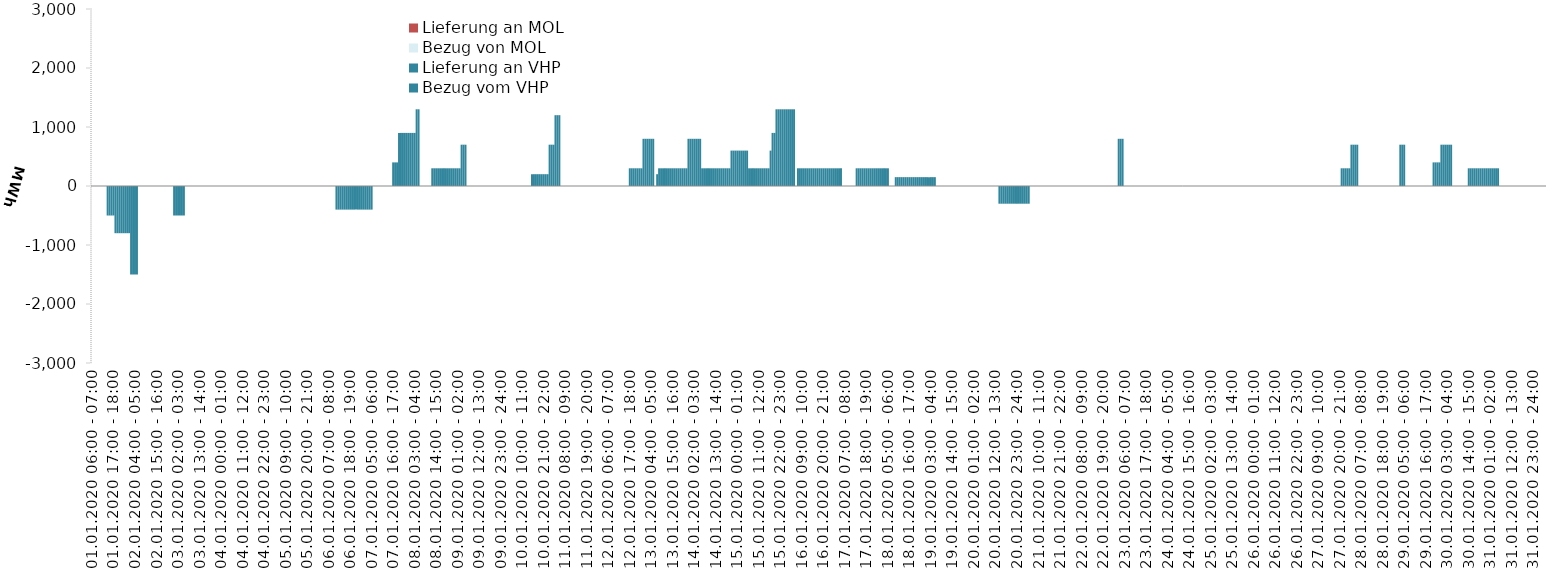
| Category | Bezug vom VHP | Lieferung an VHP | Bezug von MOL | Lieferung an MOL |
|---|---|---|---|---|
| 01.01.2020 06:00 - 07:00 | 0 | 0 | 0 | 0 |
| 01.01.2020 07:00 - 08:00 | 0 | 0 | 0 | 0 |
| 01.01.2020 08:00 - 09:00 | 0 | 0 | 0 | 0 |
| 01.01.2020 09:00 - 10:00 | 0 | 0 | 0 | 0 |
| 01.01.2020 10:00 - 11:00 | 0 | 0 | 0 | 0 |
| 01.01.2020 11:00 - 12:00 | 0 | 0 | 0 | 0 |
| 01.01.2020 12:00 - 13:00 | 0 | 0 | 0 | 0 |
| 01.01.2020 13:00 - 14:00 | 0 | 0 | 0 | 0 |
| 01.01.2020 14:00 - 15:00 | 0 | -500 | 0 | 0 |
| 01.01.2020 15:00 - 16:00 | 0 | -500 | 0 | 0 |
| 01.01.2020 16:00 - 17:00 | 0 | -500 | 0 | 0 |
| 01.01.2020 17:00 - 18:00 | 0 | -500 | 0 | 0 |
| 01.01.2020 18:00 - 19:00 | 0 | -800 | 0 | 0 |
| 01.01.2020 19:00 - 20:00 | 0 | -800 | 0 | 0 |
| 01.01.2020 20:00 - 21:00 | 0 | -800 | 0 | 0 |
| 01.01.2020 21:00 - 22:00 | 0 | -800 | 0 | 0 |
| 01.01.2020 22:00 - 23:00 | 0 | -800 | 0 | 0 |
| 01.01.2020 23:00 - 24:00 | 0 | -800 | 0 | 0 |
| 02.01.2020 00:00 - 01:00 | 0 | -800 | 0 | 0 |
| 02.01.2020 01:00 - 02:00 | 0 | -800 | 0 | 0 |
| 02.01.2020 02:00 - 03:00 | 0 | -1500 | 0 | 0 |
| 02.01.2020 03:00 - 04:00 | 0 | -1500 | 0 | 0 |
| 02.01.2020 04:00 - 05:00 | 0 | -1500 | 0 | 0 |
| 02.01.2020 05:00 - 06:00 | 0 | -1500 | 0 | 0 |
| 02.01.2020 06:00 - 07:00 | 0 | 0 | 0 | 0 |
| 02.01.2020 07:00 - 08:00 | 0 | 0 | 0 | 0 |
| 02.01.2020 08:00 - 09:00 | 0 | 0 | 0 | 0 |
| 02.01.2020 09:00 - 10:00 | 0 | 0 | 0 | 0 |
| 02.01.2020 10:00 - 11:00 | 0 | 0 | 0 | 0 |
| 02.01.2020 11:00 - 12:00 | 0 | 0 | 0 | 0 |
| 02.01.2020 12:00 - 13:00 | 0 | 0 | 0 | 0 |
| 02.01.2020 13:00 - 14:00 | 0 | 0 | 0 | 0 |
| 02.01.2020 14:00 - 15:00 | 0 | 0 | 0 | 0 |
| 02.01.2020 15:00 - 16:00 | 0 | 0 | 0 | 0 |
| 02.01.2020 16:00 - 17:00 | 0 | 0 | 0 | 0 |
| 02.01.2020 17:00 - 18:00 | 0 | 0 | 0 | 0 |
| 02.01.2020 18:00 - 19:00 | 0 | 0 | 0 | 0 |
| 02.01.2020 19:00 - 20:00 | 0 | 0 | 0 | 0 |
| 02.01.2020 20:00 - 21:00 | 0 | 0 | 0 | 0 |
| 02.01.2020 21:00 - 22:00 | 0 | 0 | 0 | 0 |
| 02.01.2020 22:00 - 23:00 | 0 | 0 | 0 | 0 |
| 02.01.2020 23:00 - 24:00 | 0 | 0 | 0 | 0 |
| 03.01.2020 00:00 - 01:00 | 0 | -500 | 0 | 0 |
| 03.01.2020 01:00 - 02:00 | 0 | -500 | 0 | 0 |
| 03.01.2020 02:00 - 03:00 | 0 | -500 | 0 | 0 |
| 03.01.2020 03:00 - 04:00 | 0 | -500 | 0 | 0 |
| 03.01.2020 04:00 - 05:00 | 0 | -500 | 0 | 0 |
| 03.01.2020 05:00 - 06:00 | 0 | -500 | 0 | 0 |
| 03.01.2020 06:00 - 07:00 | 0 | 0 | 0 | 0 |
| 03.01.2020 07:00 - 08:00 | 0 | 0 | 0 | 0 |
| 03.01.2020 08:00 - 09:00 | 0 | 0 | 0 | 0 |
| 03.01.2020 09:00 - 10:00 | 0 | 0 | 0 | 0 |
| 03.01.2020 10:00 - 11:00 | 0 | 0 | 0 | 0 |
| 03.01.2020 11:00 - 12:00 | 0 | 0 | 0 | 0 |
| 03.01.2020 12:00 - 13:00 | 0 | 0 | 0 | 0 |
| 03.01.2020 13:00 - 14:00 | 0 | 0 | 0 | 0 |
| 03.01.2020 14:00 - 15:00 | 0 | 0 | 0 | 0 |
| 03.01.2020 15:00 - 16:00 | 0 | 0 | 0 | 0 |
| 03.01.2020 16:00 - 17:00 | 0 | 0 | 0 | 0 |
| 03.01.2020 17:00 - 18:00 | 0 | 0 | 0 | 0 |
| 03.01.2020 18:00 - 19:00 | 0 | 0 | 0 | 0 |
| 03.01.2020 19:00 - 20:00 | 0 | 0 | 0 | 0 |
| 03.01.2020 20:00 - 21:00 | 0 | 0 | 0 | 0 |
| 03.01.2020 21:00 - 22:00 | 0 | 0 | 0 | 0 |
| 03.01.2020 22:00 - 23:00 | 0 | 0 | 0 | 0 |
| 03.01.2020 23:00 - 24:00 | 0 | 0 | 0 | 0 |
| 04.01.2020 00:00 - 01:00 | 0 | 0 | 0 | 0 |
| 04.01.2020 01:00 - 02:00 | 0 | 0 | 0 | 0 |
| 04.01.2020 02:00 - 03:00 | 0 | 0 | 0 | 0 |
| 04.01.2020 03:00 - 04:00 | 0 | 0 | 0 | 0 |
| 04.01.2020 04:00 - 05:00 | 0 | 0 | 0 | 0 |
| 04.01.2020 05:00 - 06:00 | 0 | 0 | 0 | 0 |
| 04.01.2020 06:00 - 07:00 | 0 | 0 | 0 | 0 |
| 04.01.2020 07:00 - 08:00 | 0 | 0 | 0 | 0 |
| 04.01.2020 08:00 - 09:00 | 0 | 0 | 0 | 0 |
| 04.01.2020 09:00 - 10:00 | 0 | 0 | 0 | 0 |
| 04.01.2020 10:00 - 11:00 | 0 | 0 | 0 | 0 |
| 04.01.2020 11:00 - 12:00 | 0 | 0 | 0 | 0 |
| 04.01.2020 12:00 - 13:00 | 0 | 0 | 0 | 0 |
| 04.01.2020 13:00 - 14:00 | 0 | 0 | 0 | 0 |
| 04.01.2020 14:00 - 15:00 | 0 | 0 | 0 | 0 |
| 04.01.2020 15:00 - 16:00 | 0 | 0 | 0 | 0 |
| 04.01.2020 16:00 - 17:00 | 0 | 0 | 0 | 0 |
| 04.01.2020 17:00 - 18:00 | 0 | 0 | 0 | 0 |
| 04.01.2020 18:00 - 19:00 | 0 | 0 | 0 | 0 |
| 04.01.2020 19:00 - 20:00 | 0 | 0 | 0 | 0 |
| 04.01.2020 20:00 - 21:00 | 0 | 0 | 0 | 0 |
| 04.01.2020 21:00 - 22:00 | 0 | 0 | 0 | 0 |
| 04.01.2020 22:00 - 23:00 | 0 | 0 | 0 | 0 |
| 04.01.2020 23:00 - 24:00 | 0 | 0 | 0 | 0 |
| 05.01.2020 00:00 - 01:00 | 0 | 0 | 0 | 0 |
| 05.01.2020 01:00 - 02:00 | 0 | 0 | 0 | 0 |
| 05.01.2020 02:00 - 03:00 | 0 | 0 | 0 | 0 |
| 05.01.2020 03:00 - 04:00 | 0 | 0 | 0 | 0 |
| 05.01.2020 04:00 - 05:00 | 0 | 0 | 0 | 0 |
| 05.01.2020 05:00 - 06:00 | 0 | 0 | 0 | 0 |
| 05.01.2020 06:00 - 07:00 | 0 | 0 | 0 | 0 |
| 05.01.2020 07:00 - 08:00 | 0 | 0 | 0 | 0 |
| 05.01.2020 08:00 - 09:00 | 0 | 0 | 0 | 0 |
| 05.01.2020 09:00 - 10:00 | 0 | 0 | 0 | 0 |
| 05.01.2020 10:00 - 11:00 | 0 | 0 | 0 | 0 |
| 05.01.2020 11:00 - 12:00 | 0 | 0 | 0 | 0 |
| 05.01.2020 12:00 - 13:00 | 0 | 0 | 0 | 0 |
| 05.01.2020 13:00 - 14:00 | 0 | 0 | 0 | 0 |
| 05.01.2020 14:00 - 15:00 | 0 | 0 | 0 | 0 |
| 05.01.2020 15:00 - 16:00 | 0 | 0 | 0 | 0 |
| 05.01.2020 16:00 - 17:00 | 0 | 0 | 0 | 0 |
| 05.01.2020 17:00 - 18:00 | 0 | 0 | 0 | 0 |
| 05.01.2020 18:00 - 19:00 | 0 | 0 | 0 | 0 |
| 05.01.2020 19:00 - 20:00 | 0 | 0 | 0 | 0 |
| 05.01.2020 20:00 - 21:00 | 0 | 0 | 0 | 0 |
| 05.01.2020 21:00 - 22:00 | 0 | 0 | 0 | 0 |
| 05.01.2020 22:00 - 23:00 | 0 | 0 | 0 | 0 |
| 05.01.2020 23:00 - 24:00 | 0 | 0 | 0 | 0 |
| 06.01.2020 00:00 - 01:00 | 0 | 0 | 0 | 0 |
| 06.01.2020 01:00 - 02:00 | 0 | 0 | 0 | 0 |
| 06.01.2020 02:00 - 03:00 | 0 | 0 | 0 | 0 |
| 06.01.2020 03:00 - 04:00 | 0 | 0 | 0 | 0 |
| 06.01.2020 04:00 - 05:00 | 0 | 0 | 0 | 0 |
| 06.01.2020 05:00 - 06:00 | 0 | 0 | 0 | 0 |
| 06.01.2020 06:00 - 07:00 | 0 | 0 | 0 | 0 |
| 06.01.2020 07:00 - 08:00 | 0 | 0 | 0 | 0 |
| 06.01.2020 08:00 - 09:00 | 0 | 0 | 0 | 0 |
| 06.01.2020 09:00 - 10:00 | 0 | 0 | 0 | 0 |
| 06.01.2020 10:00 - 11:00 | 0 | 0 | 0 | 0 |
| 06.01.2020 11:00 - 12:00 | 0 | -400 | 0 | 0 |
| 06.01.2020 12:00 - 13:00 | 0 | -400 | 0 | 0 |
| 06.01.2020 13:00 - 14:00 | 0 | -400 | 0 | 0 |
| 06.01.2020 14:00 - 15:00 | 0 | -400 | 0 | 0 |
| 06.01.2020 15:00 - 16:00 | 0 | -400 | 0 | 0 |
| 06.01.2020 16:00 - 17:00 | 0 | -400 | 0 | 0 |
| 06.01.2020 17:00 - 18:00 | 0 | -400 | 0 | 0 |
| 06.01.2020 18:00 - 19:00 | 0 | -400 | 0 | 0 |
| 06.01.2020 19:00 - 20:00 | 0 | -400 | 0 | 0 |
| 06.01.2020 20:00 - 21:00 | 0 | -400 | 0 | 0 |
| 06.01.2020 21:00 - 22:00 | 0 | -400 | 0 | 0 |
| 06.01.2020 22:00 - 23:00 | 0 | -400 | 0 | 0 |
| 06.01.2020 23:00 - 24:00 | 0 | -400 | 0 | 0 |
| 07.01.2020 00:00 - 01:00 | 0 | -400 | 0 | 0 |
| 07.01.2020 01:00 - 02:00 | 0 | -400 | 0 | 0 |
| 07.01.2020 02:00 - 03:00 | 0 | -400 | 0 | 0 |
| 07.01.2020 03:00 - 04:00 | 0 | -400 | 0 | 0 |
| 07.01.2020 04:00 - 05:00 | 0 | -400 | 0 | 0 |
| 07.01.2020 05:00 - 06:00 | 0 | -400 | 0 | 0 |
| 07.01.2020 06:00 - 07:00 | 0 | 0 | 0 | 0 |
| 07.01.2020 07:00 - 08:00 | 0 | 0 | 0 | 0 |
| 07.01.2020 08:00 - 09:00 | 0 | 0 | 0 | 0 |
| 07.01.2020 09:00 - 10:00 | 0 | 0 | 0 | 0 |
| 07.01.2020 10:00 - 11:00 | 0 | 0 | 0 | 0 |
| 07.01.2020 11:00 - 12:00 | 0 | 0 | 0 | 0 |
| 07.01.2020 12:00 - 13:00 | 0 | 0 | 0 | 0 |
| 07.01.2020 13:00 - 14:00 | 0 | 0 | 0 | 0 |
| 07.01.2020 14:00 - 15:00 | 0 | 0 | 0 | 0 |
| 07.01.2020 15:00 - 16:00 | 0 | 0 | 0 | 0 |
| 07.01.2020 16:00 - 17:00 | 400 | 0 | 0 | 0 |
| 07.01.2020 17:00 - 18:00 | 400 | 0 | 0 | 0 |
| 07.01.2020 18:00 - 19:00 | 400 | 0 | 0 | 0 |
| 07.01.2020 19:00 - 20:00 | 900 | 0 | 0 | 0 |
| 07.01.2020 20:00 - 21:00 | 900 | 0 | 0 | 0 |
| 07.01.2020 21:00 - 22:00 | 900 | 0 | 0 | 0 |
| 07.01.2020 22:00 - 23:00 | 900 | 0 | 0 | 0 |
| 07.01.2020 23:00 - 24:00 | 900 | 0 | 0 | 0 |
| 08.01.2020 00:00 - 01:00 | 900 | 0 | 0 | 0 |
| 08.01.2020 01:00 - 02:00 | 900 | 0 | 0 | 0 |
| 08.01.2020 02:00 - 03:00 | 900 | 0 | 0 | 0 |
| 08.01.2020 03:00 - 04:00 | 900 | 0 | 0 | 0 |
| 08.01.2020 04:00 - 05:00 | 1300 | 0 | 0 | 0 |
| 08.01.2020 05:00 - 06:00 | 1300 | 0 | 0 | 0 |
| 08.01.2020 06:00 - 07:00 | 0 | 0 | 0 | 0 |
| 08.01.2020 07:00 - 08:00 | 0 | 0 | 0 | 0 |
| 08.01.2020 08:00 - 09:00 | 0 | 0 | 0 | 0 |
| 08.01.2020 09:00 - 10:00 | 0 | 0 | 0 | 0 |
| 08.01.2020 10:00 - 11:00 | 0 | 0 | 0 | 0 |
| 08.01.2020 11:00 - 12:00 | 0 | 0 | 0 | 0 |
| 08.01.2020 12:00 - 13:00 | 300 | 0 | 0 | 0 |
| 08.01.2020 13:00 - 14:00 | 300 | 0 | 0 | 0 |
| 08.01.2020 14:00 - 15:00 | 300 | 0 | 0 | 0 |
| 08.01.2020 15:00 - 16:00 | 300 | 0 | 0 | 0 |
| 08.01.2020 16:00 - 17:00 | 300 | 0 | 0 | 0 |
| 08.01.2020 17:00 - 18:00 | 300 | 0 | 0 | 0 |
| 08.01.2020 18:00 - 19:00 | 300 | 0 | 0 | 0 |
| 08.01.2020 19:00 - 20:00 | 300 | 0 | 0 | 0 |
| 08.01.2020 20:00 - 21:00 | 300 | 0 | 0 | 0 |
| 08.01.2020 21:00 - 22:00 | 300 | 0 | 0 | 0 |
| 08.01.2020 22:00 - 23:00 | 300 | 0 | 0 | 0 |
| 08.01.2020 23:00 - 24:00 | 300 | 0 | 0 | 0 |
| 09.01.2020 00:00 - 01:00 | 300 | 0 | 0 | 0 |
| 09.01.2020 01:00 - 02:00 | 300 | 0 | 0 | 0 |
| 09.01.2020 02:00 - 03:00 | 300 | 0 | 0 | 0 |
| 09.01.2020 03:00 - 04:00 | 700 | 0 | 0 | 0 |
| 09.01.2020 04:00 - 05:00 | 700 | 0 | 0 | 0 |
| 09.01.2020 05:00 - 06:00 | 700 | 0 | 0 | 0 |
| 09.01.2020 06:00 - 07:00 | 0 | 0 | 0 | 0 |
| 09.01.2020 07:00 - 08:00 | 0 | 0 | 0 | 0 |
| 09.01.2020 08:00 - 09:00 | 0 | 0 | 0 | 0 |
| 09.01.2020 09:00 - 10:00 | 0 | 0 | 0 | 0 |
| 09.01.2020 10:00 - 11:00 | 0 | 0 | 0 | 0 |
| 09.01.2020 11:00 - 12:00 | 0 | 0 | 0 | 0 |
| 09.01.2020 12:00 - 13:00 | 0 | 0 | 0 | 0 |
| 09.01.2020 13:00 - 14:00 | 0 | 0 | 0 | 0 |
| 09.01.2020 14:00 - 15:00 | 0 | 0 | 0 | 0 |
| 09.01.2020 15:00 - 16:00 | 0 | 0 | 0 | 0 |
| 09.01.2020 16:00 - 17:00 | 0 | 0 | 0 | 0 |
| 09.01.2020 17:00 - 18:00 | 0 | 0 | 0 | 0 |
| 09.01.2020 18:00 - 19:00 | 0 | 0 | 0 | 0 |
| 09.01.2020 19:00 - 20:00 | 0 | 0 | 0 | 0 |
| 09.01.2020 20:00 - 21:00 | 0 | 0 | 0 | 0 |
| 09.01.2020 21:00 - 22:00 | 0 | 0 | 0 | 0 |
| 09.01.2020 22:00 - 23:00 | 0 | 0 | 0 | 0 |
| 09.01.2020 23:00 - 24:00 | 0 | 0 | 0 | 0 |
| 10.01.2020 00:00 - 01:00 | 0 | 0 | 0 | 0 |
| 10.01.2020 01:00 - 02:00 | 0 | 0 | 0 | 0 |
| 10.01.2020 02:00 - 03:00 | 0 | 0 | 0 | 0 |
| 10.01.2020 03:00 - 04:00 | 0 | 0 | 0 | 0 |
| 10.01.2020 04:00 - 05:00 | 0 | 0 | 0 | 0 |
| 10.01.2020 05:00 - 06:00 | 0 | 0 | 0 | 0 |
| 10.01.2020 06:00 - 07:00 | 0 | 0 | 0 | 0 |
| 10.01.2020 07:00 - 08:00 | 0 | 0 | 0 | 0 |
| 10.01.2020 08:00 - 09:00 | 0 | 0 | 0 | 0 |
| 10.01.2020 09:00 - 10:00 | 0 | 0 | 0 | 0 |
| 10.01.2020 10:00 - 11:00 | 0 | 0 | 0 | 0 |
| 10.01.2020 11:00 - 12:00 | 0 | 0 | 0 | 0 |
| 10.01.2020 12:00 - 13:00 | 0 | 0 | 0 | 0 |
| 10.01.2020 13:00 - 14:00 | 0 | 0 | 0 | 0 |
| 10.01.2020 14:00 - 15:00 | 0 | 0 | 0 | 0 |
| 10.01.2020 15:00 - 16:00 | 200 | 0 | 0 | 0 |
| 10.01.2020 16:00 - 17:00 | 200 | 0 | 0 | 0 |
| 10.01.2020 17:00 - 18:00 | 200 | 0 | 0 | 0 |
| 10.01.2020 18:00 - 19:00 | 200 | 0 | 0 | 0 |
| 10.01.2020 19:00 - 20:00 | 200 | 0 | 0 | 0 |
| 10.01.2020 20:00 - 21:00 | 200 | 0 | 0 | 0 |
| 10.01.2020 21:00 - 22:00 | 200 | 0 | 0 | 0 |
| 10.01.2020 22:00 - 23:00 | 200 | 0 | 0 | 0 |
| 10.01.2020 23:00 - 24:00 | 200 | 0 | 0 | 0 |
| 11.01.2020 00:00 - 01:00 | 700 | 0 | 0 | 0 |
| 11.01.2020 01:00 - 02:00 | 700 | 0 | 0 | 0 |
| 11.01.2020 02:00 - 03:00 | 700 | 0 | 0 | 0 |
| 11.01.2020 03:00 - 04:00 | 1200 | 0 | 0 | 0 |
| 11.01.2020 04:00 - 05:00 | 1200 | 0 | 0 | 0 |
| 11.01.2020 05:00 - 06:00 | 1200 | 0 | 0 | 0 |
| 11.01.2020 06:00 - 07:00 | 0 | 0 | 0 | 0 |
| 11.01.2020 07:00 - 08:00 | 0 | 0 | 0 | 0 |
| 11.01.2020 08:00 - 09:00 | 0 | 0 | 0 | 0 |
| 11.01.2020 09:00 - 10:00 | 0 | 0 | 0 | 0 |
| 11.01.2020 10:00 - 11:00 | 0 | 0 | 0 | 0 |
| 11.01.2020 11:00 - 12:00 | 0 | 0 | 0 | 0 |
| 11.01.2020 12:00 - 13:00 | 0 | 0 | 0 | 0 |
| 11.01.2020 13:00 - 14:00 | 0 | 0 | 0 | 0 |
| 11.01.2020 14:00 - 15:00 | 0 | 0 | 0 | 0 |
| 11.01.2020 15:00 - 16:00 | 0 | 0 | 0 | 0 |
| 11.01.2020 16:00 - 17:00 | 0 | 0 | 0 | 0 |
| 11.01.2020 17:00 - 18:00 | 0 | 0 | 0 | 0 |
| 11.01.2020 18:00 - 19:00 | 0 | 0 | 0 | 0 |
| 11.01.2020 19:00 - 20:00 | 0 | 0 | 0 | 0 |
| 11.01.2020 20:00 - 21:00 | 0 | 0 | 0 | 0 |
| 11.01.2020 21:00 - 22:00 | 0 | 0 | 0 | 0 |
| 11.01.2020 22:00 - 23:00 | 0 | 0 | 0 | 0 |
| 11.01.2020 23:00 - 24:00 | 0 | 0 | 0 | 0 |
| 12.01.2020 00:00 - 01:00 | 0 | 0 | 0 | 0 |
| 12.01.2020 01:00 - 02:00 | 0 | 0 | 0 | 0 |
| 12.01.2020 02:00 - 03:00 | 0 | 0 | 0 | 0 |
| 12.01.2020 03:00 - 04:00 | 0 | 0 | 0 | 0 |
| 12.01.2020 04:00 - 05:00 | 0 | 0 | 0 | 0 |
| 12.01.2020 05:00 - 06:00 | 0 | 0 | 0 | 0 |
| 12.01.2020 06:00 - 07:00 | 0 | 0 | 0 | 0 |
| 12.01.2020 07:00 - 08:00 | 0 | 0 | 0 | 0 |
| 12.01.2020 08:00 - 09:00 | 0 | 0 | 0 | 0 |
| 12.01.2020 09:00 - 10:00 | 0 | 0 | 0 | 0 |
| 12.01.2020 10:00 - 11:00 | 0 | 0 | 0 | 0 |
| 12.01.2020 11:00 - 12:00 | 0 | 0 | 0 | 0 |
| 12.01.2020 12:00 - 13:00 | 0 | 0 | 0 | 0 |
| 12.01.2020 13:00 - 14:00 | 0 | 0 | 0 | 0 |
| 12.01.2020 14:00 - 15:00 | 0 | 0 | 0 | 0 |
| 12.01.2020 15:00 - 16:00 | 0 | 0 | 0 | 0 |
| 12.01.2020 16:00 - 17:00 | 0 | 0 | 0 | 0 |
| 12.01.2020 17:00 - 18:00 | 300 | 0 | 0 | 0 |
| 12.01.2020 18:00 - 19:00 | 300 | 0 | 0 | 0 |
| 12.01.2020 19:00 - 20:00 | 300 | 0 | 0 | 0 |
| 12.01.2020 20:00 - 21:00 | 300 | 0 | 0 | 0 |
| 12.01.2020 21:00 - 22:00 | 300 | 0 | 0 | 0 |
| 12.01.2020 22:00 - 23:00 | 300 | 0 | 0 | 0 |
| 12.01.2020 23:00 - 24:00 | 300 | 0 | 0 | 0 |
| 13.01.2020 00:00 - 01:00 | 800 | 0 | 0 | 0 |
| 13.01.2020 01:00 - 02:00 | 800 | 0 | 0 | 0 |
| 13.01.2020 02:00 - 03:00 | 800 | 0 | 0 | 0 |
| 13.01.2020 03:00 - 04:00 | 800 | 0 | 0 | 0 |
| 13.01.2020 04:00 - 05:00 | 800 | 0 | 0 | 0 |
| 13.01.2020 05:00 - 06:00 | 800 | 0 | 0 | 0 |
| 13.01.2020 06:00 - 07:00 | 0 | 0 | 0 | 0 |
| 13.01.2020 07:00 - 08:00 | 200 | 0 | 0 | 0 |
| 13.01.2020 08:00 - 09:00 | 300 | 0 | 0 | 0 |
| 13.01.2020 09:00 - 10:00 | 300 | 0 | 0 | 0 |
| 13.01.2020 10:00 - 11:00 | 300 | 0 | 0 | 0 |
| 13.01.2020 11:00 - 12:00 | 300 | 0 | 0 | 0 |
| 13.01.2020 12:00 - 13:00 | 300 | 0 | 0 | 0 |
| 13.01.2020 13:00 - 14:00 | 300 | 0 | 0 | 0 |
| 13.01.2020 14:00 - 15:00 | 300 | 0 | 0 | 0 |
| 13.01.2020 15:00 - 16:00 | 300 | 0 | 0 | 0 |
| 13.01.2020 16:00 - 17:00 | 300 | 0 | 0 | 0 |
| 13.01.2020 17:00 - 18:00 | 300 | 0 | 0 | 0 |
| 13.01.2020 18:00 - 19:00 | 300 | 0 | 0 | 0 |
| 13.01.2020 19:00 - 20:00 | 300 | 0 | 0 | 0 |
| 13.01.2020 20:00 - 21:00 | 300 | 0 | 0 | 0 |
| 13.01.2020 21:00 - 22:00 | 300 | 0 | 0 | 0 |
| 13.01.2020 22:00 - 23:00 | 300 | 0 | 0 | 0 |
| 13.01.2020 23:00 - 24:00 | 800 | 0 | 0 | 0 |
| 14.01.2020 00:00 - 01:00 | 800 | 0 | 0 | 0 |
| 14.01.2020 01:00 - 02:00 | 800 | 0 | 0 | 0 |
| 14.01.2020 02:00 - 03:00 | 800 | 0 | 0 | 0 |
| 14.01.2020 03:00 - 04:00 | 800 | 0 | 0 | 0 |
| 14.01.2020 04:00 - 05:00 | 800 | 0 | 0 | 0 |
| 14.01.2020 05:00 - 06:00 | 800 | 0 | 0 | 0 |
| 14.01.2020 06:00 - 07:00 | 300 | 0 | 0 | 0 |
| 14.01.2020 07:00 - 08:00 | 300 | 0 | 0 | 0 |
| 14.01.2020 08:00 - 09:00 | 300 | 0 | 0 | 0 |
| 14.01.2020 09:00 - 10:00 | 300 | 0 | 0 | 0 |
| 14.01.2020 10:00 - 11:00 | 300 | 0 | 0 | 0 |
| 14.01.2020 11:00 - 12:00 | 300 | 0 | 0 | 0 |
| 14.01.2020 12:00 - 13:00 | 300 | 0 | 0 | 0 |
| 14.01.2020 13:00 - 14:00 | 300 | 0 | 0 | 0 |
| 14.01.2020 14:00 - 15:00 | 300 | 0 | 0 | 0 |
| 14.01.2020 15:00 - 16:00 | 300 | 0 | 0 | 0 |
| 14.01.2020 16:00 - 17:00 | 300 | 0 | 0 | 0 |
| 14.01.2020 17:00 - 18:00 | 300 | 0 | 0 | 0 |
| 14.01.2020 18:00 - 19:00 | 300 | 0 | 0 | 0 |
| 14.01.2020 19:00 - 20:00 | 300 | 0 | 0 | 0 |
| 14.01.2020 20:00 - 21:00 | 300 | 0 | 0 | 0 |
| 14.01.2020 21:00 - 22:00 | 600 | 0 | 0 | 0 |
| 14.01.2020 22:00 - 23:00 | 600 | 0 | 0 | 0 |
| 14.01.2020 23:00 - 24:00 | 600 | 0 | 0 | 0 |
| 15.01.2020 00:00 - 01:00 | 600 | 0 | 0 | 0 |
| 15.01.2020 01:00 - 02:00 | 600 | 0 | 0 | 0 |
| 15.01.2020 02:00 - 03:00 | 600 | 0 | 0 | 0 |
| 15.01.2020 03:00 - 04:00 | 600 | 0 | 0 | 0 |
| 15.01.2020 04:00 - 05:00 | 600 | 0 | 0 | 0 |
| 15.01.2020 05:00 - 06:00 | 600 | 0 | 0 | 0 |
| 15.01.2020 06:00 - 07:00 | 300 | 0 | 0 | 0 |
| 15.01.2020 07:00 - 08:00 | 300 | 0 | 0 | 0 |
| 15.01.2020 08:00 - 09:00 | 300 | 0 | 0 | 0 |
| 15.01.2020 09:00 - 10:00 | 300 | 0 | 0 | 0 |
| 15.01.2020 10:00 - 11:00 | 300 | 0 | 0 | 0 |
| 15.01.2020 11:00 - 12:00 | 300 | 0 | 0 | 0 |
| 15.01.2020 12:00 - 13:00 | 300 | 0 | 0 | 0 |
| 15.01.2020 13:00 - 14:00 | 300 | 0 | 0 | 0 |
| 15.01.2020 14:00 - 15:00 | 300 | 0 | 0 | 0 |
| 15.01.2020 15:00 - 16:00 | 300 | 0 | 0 | 0 |
| 15.01.2020 16:00 - 17:00 | 300 | 0 | 0 | 0 |
| 15.01.2020 17:00 - 18:00 | 600 | 0 | 0 | 0 |
| 15.01.2020 18:00 - 19:00 | 900 | 0 | 0 | 0 |
| 15.01.2020 19:00 - 20:00 | 900 | 0 | 0 | 0 |
| 15.01.2020 20:00 - 21:00 | 1300 | 0 | 0 | 0 |
| 15.01.2020 21:00 - 22:00 | 1300 | 0 | 0 | 0 |
| 15.01.2020 22:00 - 23:00 | 1300 | 0 | 0 | 0 |
| 15.01.2020 23:00 - 24:00 | 1300 | 0 | 0 | 0 |
| 16.01.2020 00:00 - 01:00 | 1300 | 0 | 0 | 0 |
| 16.01.2020 01:00 - 02:00 | 1300 | 0 | 0 | 0 |
| 16.01.2020 02:00 - 03:00 | 1300 | 0 | 0 | 0 |
| 16.01.2020 03:00 - 04:00 | 1300 | 0 | 0 | 0 |
| 16.01.2020 04:00 - 05:00 | 1300 | 0 | 0 | 0 |
| 16.01.2020 05:00 - 06:00 | 1300 | 0 | 0 | 0 |
| 16.01.2020 06:00 - 07:00 | 0 | 0 | 0 | 0 |
| 16.01.2020 07:00 - 08:00 | 300 | 0 | 0 | 0 |
| 16.01.2020 08:00 - 09:00 | 300 | 0 | 0 | 0 |
| 16.01.2020 09:00 - 10:00 | 300 | 0 | 0 | 0 |
| 16.01.2020 10:00 - 11:00 | 300 | 0 | 0 | 0 |
| 16.01.2020 11:00 - 12:00 | 300 | 0 | 0 | 0 |
| 16.01.2020 12:00 - 13:00 | 300 | 0 | 0 | 0 |
| 16.01.2020 13:00 - 14:00 | 300 | 0 | 0 | 0 |
| 16.01.2020 14:00 - 15:00 | 300 | 0 | 0 | 0 |
| 16.01.2020 15:00 - 16:00 | 300 | 0 | 0 | 0 |
| 16.01.2020 16:00 - 17:00 | 300 | 0 | 0 | 0 |
| 16.01.2020 17:00 - 18:00 | 300 | 0 | 0 | 0 |
| 16.01.2020 18:00 - 19:00 | 300 | 0 | 0 | 0 |
| 16.01.2020 19:00 - 20:00 | 300 | 0 | 0 | 0 |
| 16.01.2020 20:00 - 21:00 | 300 | 0 | 0 | 0 |
| 16.01.2020 21:00 - 22:00 | 300 | 0 | 0 | 0 |
| 16.01.2020 22:00 - 23:00 | 300 | 0 | 0 | 0 |
| 16.01.2020 23:00 - 24:00 | 300 | 0 | 0 | 0 |
| 17.01.2020 00:00 - 01:00 | 300 | 0 | 0 | 0 |
| 17.01.2020 01:00 - 02:00 | 300 | 0 | 0 | 0 |
| 17.01.2020 02:00 - 03:00 | 300 | 0 | 0 | 0 |
| 17.01.2020 03:00 - 04:00 | 300 | 0 | 0 | 0 |
| 17.01.2020 04:00 - 05:00 | 300 | 0 | 0 | 0 |
| 17.01.2020 05:00 - 06:00 | 300 | 0 | 0 | 0 |
| 17.01.2020 06:00 - 07:00 | 0 | 0 | 0 | 0 |
| 17.01.2020 07:00 - 08:00 | 0 | 0 | 0 | 0 |
| 17.01.2020 08:00 - 09:00 | 0 | 0 | 0 | 0 |
| 17.01.2020 09:00 - 10:00 | 0 | 0 | 0 | 0 |
| 17.01.2020 10:00 - 11:00 | 0 | 0 | 0 | 0 |
| 17.01.2020 11:00 - 12:00 | 0 | 0 | 0 | 0 |
| 17.01.2020 12:00 - 13:00 | 0 | 0 | 0 | 0 |
| 17.01.2020 13:00 - 14:00 | 300 | 0 | 0 | 0 |
| 17.01.2020 14:00 - 15:00 | 300 | 0 | 0 | 0 |
| 17.01.2020 15:00 - 16:00 | 300 | 0 | 0 | 0 |
| 17.01.2020 16:00 - 17:00 | 300 | 0 | 0 | 0 |
| 17.01.2020 17:00 - 18:00 | 300 | 0 | 0 | 0 |
| 17.01.2020 18:00 - 19:00 | 300 | 0 | 0 | 0 |
| 17.01.2020 19:00 - 20:00 | 300 | 0 | 0 | 0 |
| 17.01.2020 20:00 - 21:00 | 300 | 0 | 0 | 0 |
| 17.01.2020 21:00 - 22:00 | 300 | 0 | 0 | 0 |
| 17.01.2020 22:00 - 23:00 | 300 | 0 | 0 | 0 |
| 17.01.2020 23:00 - 24:00 | 300 | 0 | 0 | 0 |
| 18.01.2020 00:00 - 01:00 | 300 | 0 | 0 | 0 |
| 18.01.2020 01:00 - 02:00 | 300 | 0 | 0 | 0 |
| 18.01.2020 02:00 - 03:00 | 300 | 0 | 0 | 0 |
| 18.01.2020 03:00 - 04:00 | 300 | 0 | 0 | 0 |
| 18.01.2020 04:00 - 05:00 | 300 | 0 | 0 | 0 |
| 18.01.2020 05:00 - 06:00 | 300 | 0 | 0 | 0 |
| 18.01.2020 06:00 - 07:00 | 0 | 0 | 0 | 0 |
| 18.01.2020 07:00 - 08:00 | 0 | 0 | 0 | 0 |
| 18.01.2020 08:00 - 09:00 | 0 | 0 | 0 | 0 |
| 18.01.2020 09:00 - 10:00 | 150 | 0 | 0 | 0 |
| 18.01.2020 10:00 - 11:00 | 150 | 0 | 0 | 0 |
| 18.01.2020 11:00 - 12:00 | 150 | 0 | 0 | 0 |
| 18.01.2020 12:00 - 13:00 | 150 | 0 | 0 | 0 |
| 18.01.2020 13:00 - 14:00 | 150 | 0 | 0 | 0 |
| 18.01.2020 14:00 - 15:00 | 150 | 0 | 0 | 0 |
| 18.01.2020 15:00 - 16:00 | 150 | 0 | 0 | 0 |
| 18.01.2020 16:00 - 17:00 | 150 | 0 | 0 | 0 |
| 18.01.2020 17:00 - 18:00 | 150 | 0 | 0 | 0 |
| 18.01.2020 18:00 - 19:00 | 150 | 0 | 0 | 0 |
| 18.01.2020 19:00 - 20:00 | 150 | 0 | 0 | 0 |
| 18.01.2020 20:00 - 21:00 | 150 | 0 | 0 | 0 |
| 18.01.2020 21:00 - 22:00 | 150 | 0 | 0 | 0 |
| 18.01.2020 22:00 - 23:00 | 150 | 0 | 0 | 0 |
| 18.01.2020 23:00 - 24:00 | 150 | 0 | 0 | 0 |
| 19.01.2020 00:00 - 01:00 | 150 | 0 | 0 | 0 |
| 19.01.2020 01:00 - 02:00 | 150 | 0 | 0 | 0 |
| 19.01.2020 02:00 - 03:00 | 150 | 0 | 0 | 0 |
| 19.01.2020 03:00 - 04:00 | 150 | 0 | 0 | 0 |
| 19.01.2020 04:00 - 05:00 | 150 | 0 | 0 | 0 |
| 19.01.2020 05:00 - 06:00 | 150 | 0 | 0 | 0 |
| 19.01.2020 06:00 - 07:00 | 0 | 0 | 0 | 0 |
| 19.01.2020 07:00 - 08:00 | 0 | 0 | 0 | 0 |
| 19.01.2020 08:00 - 09:00 | 0 | 0 | 0 | 0 |
| 19.01.2020 09:00 - 10:00 | 0 | 0 | 0 | 0 |
| 19.01.2020 10:00 - 11:00 | 0 | 0 | 0 | 0 |
| 19.01.2020 11:00 - 12:00 | 0 | 0 | 0 | 0 |
| 19.01.2020 12:00 - 13:00 | 0 | 0 | 0 | 0 |
| 19.01.2020 13:00 - 14:00 | 0 | 0 | 0 | 0 |
| 19.01.2020 14:00 - 15:00 | 0 | 0 | 0 | 0 |
| 19.01.2020 15:00 - 16:00 | 0 | 0 | 0 | 0 |
| 19.01.2020 16:00 - 17:00 | 0 | 0 | 0 | 0 |
| 19.01.2020 17:00 - 18:00 | 0 | 0 | 0 | 0 |
| 19.01.2020 18:00 - 19:00 | 0 | 0 | 0 | 0 |
| 19.01.2020 19:00 - 20:00 | 0 | 0 | 0 | 0 |
| 19.01.2020 20:00 - 21:00 | 0 | 0 | 0 | 0 |
| 19.01.2020 21:00 - 22:00 | 0 | 0 | 0 | 0 |
| 19.01.2020 22:00 - 23:00 | 0 | 0 | 0 | 0 |
| 19.01.2020 23:00 - 24:00 | 0 | 0 | 0 | 0 |
| 20.01.2020 00:00 - 01:00 | 0 | 0 | 0 | 0 |
| 20.01.2020 01:00 - 02:00 | 0 | 0 | 0 | 0 |
| 20.01.2020 02:00 - 03:00 | 0 | 0 | 0 | 0 |
| 20.01.2020 03:00 - 04:00 | 0 | 0 | 0 | 0 |
| 20.01.2020 04:00 - 05:00 | 0 | 0 | 0 | 0 |
| 20.01.2020 05:00 - 06:00 | 0 | 0 | 0 | 0 |
| 20.01.2020 06:00 - 07:00 | 0 | 0 | 0 | 0 |
| 20.01.2020 07:00 - 08:00 | 0 | 0 | 0 | 0 |
| 20.01.2020 08:00 - 09:00 | 0 | 0 | 0 | 0 |
| 20.01.2020 09:00 - 10:00 | 0 | 0 | 0 | 0 |
| 20.01.2020 10:00 - 11:00 | 0 | 0 | 0 | 0 |
| 20.01.2020 11:00 - 12:00 | 0 | 0 | 0 | 0 |
| 20.01.2020 12:00 - 13:00 | 0 | 0 | 0 | 0 |
| 20.01.2020 13:00 - 14:00 | 0 | 0 | 0 | 0 |
| 20.01.2020 14:00 - 15:00 | 0 | -300 | 0 | 0 |
| 20.01.2020 15:00 - 16:00 | 0 | -300 | 0 | 0 |
| 20.01.2020 16:00 - 17:00 | 0 | -300 | 0 | 0 |
| 20.01.2020 17:00 - 18:00 | 0 | -300 | 0 | 0 |
| 20.01.2020 18:00 - 19:00 | 0 | -300 | 0 | 0 |
| 20.01.2020 19:00 - 20:00 | 0 | -300 | 0 | 0 |
| 20.01.2020 20:00 - 21:00 | 0 | -300 | 0 | 0 |
| 20.01.2020 21:00 - 22:00 | 0 | -300 | 0 | 0 |
| 20.01.2020 22:00 - 23:00 | 0 | -300 | 0 | 0 |
| 20.01.2020 23:00 - 24:00 | 0 | -300 | 0 | 0 |
| 21.01.2020 00:00 - 01:00 | 0 | -300 | 0 | 0 |
| 21.01.2020 01:00 - 02:00 | 0 | -300 | 0 | 0 |
| 21.01.2020 02:00 - 03:00 | 0 | -300 | 0 | 0 |
| 21.01.2020 03:00 - 04:00 | 0 | -300 | 0 | 0 |
| 21.01.2020 04:00 - 05:00 | 0 | -300 | 0 | 0 |
| 21.01.2020 05:00 - 06:00 | 0 | -300 | 0 | 0 |
| 21.01.2020 06:00 - 07:00 | 0 | 0 | 0 | 0 |
| 21.01.2020 07:00 - 08:00 | 0 | 0 | 0 | 0 |
| 21.01.2020 08:00 - 09:00 | 0 | 0 | 0 | 0 |
| 21.01.2020 09:00 - 10:00 | 0 | 0 | 0 | 0 |
| 21.01.2020 10:00 - 11:00 | 0 | 0 | 0 | 0 |
| 21.01.2020 11:00 - 12:00 | 0 | 0 | 0 | 0 |
| 21.01.2020 12:00 - 13:00 | 0 | 0 | 0 | 0 |
| 21.01.2020 13:00 - 14:00 | 0 | 0 | 0 | 0 |
| 21.01.2020 14:00 - 15:00 | 0 | 0 | 0 | 0 |
| 21.01.2020 15:00 - 16:00 | 0 | 0 | 0 | 0 |
| 21.01.2020 16:00 - 17:00 | 0 | 0 | 0 | 0 |
| 21.01.2020 17:00 - 18:00 | 0 | 0 | 0 | 0 |
| 21.01.2020 18:00 - 19:00 | 0 | 0 | 0 | 0 |
| 21.01.2020 19:00 - 20:00 | 0 | 0 | 0 | 0 |
| 21.01.2020 20:00 - 21:00 | 0 | 0 | 0 | 0 |
| 21.01.2020 21:00 - 22:00 | 0 | 0 | 0 | 0 |
| 21.01.2020 22:00 - 23:00 | 0 | 0 | 0 | 0 |
| 21.01.2020 23:00 - 24:00 | 0 | 0 | 0 | 0 |
| 22.01.2020 00:00 - 01:00 | 0 | 0 | 0 | 0 |
| 22.01.2020 01:00 - 02:00 | 0 | 0 | 0 | 0 |
| 22.01.2020 02:00 - 03:00 | 0 | 0 | 0 | 0 |
| 22.01.2020 03:00 - 04:00 | 0 | 0 | 0 | 0 |
| 22.01.2020 04:00 - 05:00 | 0 | 0 | 0 | 0 |
| 22.01.2020 05:00 - 06:00 | 0 | 0 | 0 | 0 |
| 22.01.2020 06:00 - 07:00 | 0 | 0 | 0 | 0 |
| 22.01.2020 07:00 - 08:00 | 0 | 0 | 0 | 0 |
| 22.01.2020 08:00 - 09:00 | 0 | 0 | 0 | 0 |
| 22.01.2020 09:00 - 10:00 | 0 | 0 | 0 | 0 |
| 22.01.2020 10:00 - 11:00 | 0 | 0 | 0 | 0 |
| 22.01.2020 11:00 - 12:00 | 0 | 0 | 0 | 0 |
| 22.01.2020 12:00 - 13:00 | 0 | 0 | 0 | 0 |
| 22.01.2020 13:00 - 14:00 | 0 | 0 | 0 | 0 |
| 22.01.2020 14:00 - 15:00 | 0 | 0 | 0 | 0 |
| 22.01.2020 15:00 - 16:00 | 0 | 0 | 0 | 0 |
| 22.01.2020 16:00 - 17:00 | 0 | 0 | 0 | 0 |
| 22.01.2020 17:00 - 18:00 | 0 | 0 | 0 | 0 |
| 22.01.2020 18:00 - 19:00 | 0 | 0 | 0 | 0 |
| 22.01.2020 19:00 - 20:00 | 0 | 0 | 0 | 0 |
| 22.01.2020 20:00 - 21:00 | 0 | 0 | 0 | 0 |
| 22.01.2020 21:00 - 22:00 | 0 | 0 | 0 | 0 |
| 22.01.2020 22:00 - 23:00 | 0 | 0 | 0 | 0 |
| 22.01.2020 23:00 - 24:00 | 0 | 0 | 0 | 0 |
| 23.01.2020 00:00 - 01:00 | 0 | 0 | 0 | 0 |
| 23.01.2020 01:00 - 02:00 | 0 | 0 | 0 | 0 |
| 23.01.2020 02:00 - 03:00 | 0 | 0 | 0 | 0 |
| 23.01.2020 03:00 - 04:00 | 800 | 0 | 0 | 0 |
| 23.01.2020 04:00 - 05:00 | 800 | 0 | 0 | 0 |
| 23.01.2020 05:00 - 06:00 | 800 | 0 | 0 | 0 |
| 23.01.2020 06:00 - 07:00 | 0 | 0 | 0 | 0 |
| 23.01.2020 07:00 - 08:00 | 0 | 0 | 0 | 0 |
| 23.01.2020 08:00 - 09:00 | 0 | 0 | 0 | 0 |
| 23.01.2020 09:00 - 10:00 | 0 | 0 | 0 | 0 |
| 23.01.2020 10:00 - 11:00 | 0 | 0 | 0 | 0 |
| 23.01.2020 11:00 - 12:00 | 0 | 0 | 0 | 0 |
| 23.01.2020 12:00 - 13:00 | 0 | 0 | 0 | 0 |
| 23.01.2020 13:00 - 14:00 | 0 | 0 | 0 | 0 |
| 23.01.2020 14:00 - 15:00 | 0 | 0 | 0 | 0 |
| 23.01.2020 15:00 - 16:00 | 0 | 0 | 0 | 0 |
| 23.01.2020 16:00 - 17:00 | 0 | 0 | 0 | 0 |
| 23.01.2020 17:00 - 18:00 | 0 | 0 | 0 | 0 |
| 23.01.2020 18:00 - 19:00 | 0 | 0 | 0 | 0 |
| 23.01.2020 19:00 - 20:00 | 0 | 0 | 0 | 0 |
| 23.01.2020 20:00 - 21:00 | 0 | 0 | 0 | 0 |
| 23.01.2020 21:00 - 22:00 | 0 | 0 | 0 | 0 |
| 23.01.2020 22:00 - 23:00 | 0 | 0 | 0 | 0 |
| 23.01.2020 23:00 - 24:00 | 0 | 0 | 0 | 0 |
| 24.01.2020 00:00 - 01:00 | 0 | 0 | 0 | 0 |
| 24.01.2020 01:00 - 02:00 | 0 | 0 | 0 | 0 |
| 24.01.2020 02:00 - 03:00 | 0 | 0 | 0 | 0 |
| 24.01.2020 03:00 - 04:00 | 0 | 0 | 0 | 0 |
| 24.01.2020 04:00 - 05:00 | 0 | 0 | 0 | 0 |
| 24.01.2020 05:00 - 06:00 | 0 | 0 | 0 | 0 |
| 24.01.2020 06:00 - 07:00 | 0 | 0 | 0 | 0 |
| 24.01.2020 07:00 - 08:00 | 0 | 0 | 0 | 0 |
| 24.01.2020 08:00 - 09:00 | 0 | 0 | 0 | 0 |
| 24.01.2020 09:00 - 10:00 | 0 | 0 | 0 | 0 |
| 24.01.2020 10:00 - 11:00 | 0 | 0 | 0 | 0 |
| 24.01.2020 11:00 - 12:00 | 0 | 0 | 0 | 0 |
| 24.01.2020 12:00 - 13:00 | 0 | 0 | 0 | 0 |
| 24.01.2020 13:00 - 14:00 | 0 | 0 | 0 | 0 |
| 24.01.2020 14:00 - 15:00 | 0 | 0 | 0 | 0 |
| 24.01.2020 15:00 - 16:00 | 0 | 0 | 0 | 0 |
| 24.01.2020 16:00 - 17:00 | 0 | 0 | 0 | 0 |
| 24.01.2020 17:00 - 18:00 | 0 | 0 | 0 | 0 |
| 24.01.2020 18:00 - 19:00 | 0 | 0 | 0 | 0 |
| 24.01.2020 19:00 - 20:00 | 0 | 0 | 0 | 0 |
| 24.01.2020 20:00 - 21:00 | 0 | 0 | 0 | 0 |
| 24.01.2020 21:00 - 22:00 | 0 | 0 | 0 | 0 |
| 24.01.2020 22:00 - 23:00 | 0 | 0 | 0 | 0 |
| 24.01.2020 23:00 - 24:00 | 0 | 0 | 0 | 0 |
| 25.01.2020 00:00 - 01:00 | 0 | 0 | 0 | 0 |
| 25.01.2020 01:00 - 02:00 | 0 | 0 | 0 | 0 |
| 25.01.2020 02:00 - 03:00 | 0 | 0 | 0 | 0 |
| 25.01.2020 03:00 - 04:00 | 0 | 0 | 0 | 0 |
| 25.01.2020 04:00 - 05:00 | 0 | 0 | 0 | 0 |
| 25.01.2020 05:00 - 06:00 | 0 | 0 | 0 | 0 |
| 25.01.2020 06:00 - 07:00 | 0 | 0 | 0 | 0 |
| 25.01.2020 07:00 - 08:00 | 0 | 0 | 0 | 0 |
| 25.01.2020 08:00 - 09:00 | 0 | 0 | 0 | 0 |
| 25.01.2020 09:00 - 10:00 | 0 | 0 | 0 | 0 |
| 25.01.2020 10:00 - 11:00 | 0 | 0 | 0 | 0 |
| 25.01.2020 11:00 - 12:00 | 0 | 0 | 0 | 0 |
| 25.01.2020 12:00 - 13:00 | 0 | 0 | 0 | 0 |
| 25.01.2020 13:00 - 14:00 | 0 | 0 | 0 | 0 |
| 25.01.2020 14:00 - 15:00 | 0 | 0 | 0 | 0 |
| 25.01.2020 15:00 - 16:00 | 0 | 0 | 0 | 0 |
| 25.01.2020 16:00 - 17:00 | 0 | 0 | 0 | 0 |
| 25.01.2020 17:00 - 18:00 | 0 | 0 | 0 | 0 |
| 25.01.2020 18:00 - 19:00 | 0 | 0 | 0 | 0 |
| 25.01.2020 19:00 - 20:00 | 0 | 0 | 0 | 0 |
| 25.01.2020 20:00 - 21:00 | 0 | 0 | 0 | 0 |
| 25.01.2020 21:00 - 22:00 | 0 | 0 | 0 | 0 |
| 25.01.2020 22:00 - 23:00 | 0 | 0 | 0 | 0 |
| 25.01.2020 23:00 - 24:00 | 0 | 0 | 0 | 0 |
| 26.01.2020 00:00 - 01:00 | 0 | 0 | 0 | 0 |
| 26.01.2020 01:00 - 02:00 | 0 | 0 | 0 | 0 |
| 26.01.2020 02:00 - 03:00 | 0 | 0 | 0 | 0 |
| 26.01.2020 03:00 - 04:00 | 0 | 0 | 0 | 0 |
| 26.01.2020 04:00 - 05:00 | 0 | 0 | 0 | 0 |
| 26.01.2020 05:00 - 06:00 | 0 | 0 | 0 | 0 |
| 26.01.2020 06:00 - 07:00 | 0 | 0 | 0 | 0 |
| 26.01.2020 07:00 - 08:00 | 0 | 0 | 0 | 0 |
| 26.01.2020 08:00 - 09:00 | 0 | 0 | 0 | 0 |
| 26.01.2020 09:00 - 10:00 | 0 | 0 | 0 | 0 |
| 26.01.2020 10:00 - 11:00 | 0 | 0 | 0 | 0 |
| 26.01.2020 11:00 - 12:00 | 0 | 0 | 0 | 0 |
| 26.01.2020 12:00 - 13:00 | 0 | 0 | 0 | 0 |
| 26.01.2020 13:00 - 14:00 | 0 | 0 | 0 | 0 |
| 26.01.2020 14:00 - 15:00 | 0 | 0 | 0 | 0 |
| 26.01.2020 15:00 - 16:00 | 0 | 0 | 0 | 0 |
| 26.01.2020 16:00 - 17:00 | 0 | 0 | 0 | 0 |
| 26.01.2020 17:00 - 18:00 | 0 | 0 | 0 | 0 |
| 26.01.2020 18:00 - 19:00 | 0 | 0 | 0 | 0 |
| 26.01.2020 19:00 - 20:00 | 0 | 0 | 0 | 0 |
| 26.01.2020 20:00 - 21:00 | 0 | 0 | 0 | 0 |
| 26.01.2020 21:00 - 22:00 | 0 | 0 | 0 | 0 |
| 26.01.2020 22:00 - 23:00 | 0 | 0 | 0 | 0 |
| 26.01.2020 23:00 - 24:00 | 0 | 0 | 0 | 0 |
| 27.01.2020 00:00 - 01:00 | 0 | 0 | 0 | 0 |
| 27.01.2020 01:00 - 02:00 | 0 | 0 | 0 | 0 |
| 27.01.2020 02:00 - 03:00 | 0 | 0 | 0 | 0 |
| 27.01.2020 03:00 - 04:00 | 0 | 0 | 0 | 0 |
| 27.01.2020 04:00 - 05:00 | 0 | 0 | 0 | 0 |
| 27.01.2020 05:00 - 06:00 | 0 | 0 | 0 | 0 |
| 27.01.2020 06:00 - 07:00 | 0 | 0 | 0 | 0 |
| 27.01.2020 07:00 - 08:00 | 0 | 0 | 0 | 0 |
| 27.01.2020 08:00 - 09:00 | 0 | 0 | 0 | 0 |
| 27.01.2020 09:00 - 10:00 | 0 | 0 | 0 | 0 |
| 27.01.2020 10:00 - 11:00 | 0 | 0 | 0 | 0 |
| 27.01.2020 11:00 - 12:00 | 0 | 0 | 0 | 0 |
| 27.01.2020 12:00 - 13:00 | 0 | 0 | 0 | 0 |
| 27.01.2020 13:00 - 14:00 | 0 | 0 | 0 | 0 |
| 27.01.2020 14:00 - 15:00 | 0 | 0 | 0 | 0 |
| 27.01.2020 15:00 - 16:00 | 0 | 0 | 0 | 0 |
| 27.01.2020 16:00 - 17:00 | 0 | 0 | 0 | 0 |
| 27.01.2020 17:00 - 18:00 | 0 | 0 | 0 | 0 |
| 27.01.2020 18:00 - 19:00 | 0 | 0 | 0 | 0 |
| 27.01.2020 19:00 - 20:00 | 0 | 0 | 0 | 0 |
| 27.01.2020 20:00 - 21:00 | 0 | 0 | 0 | 0 |
| 27.01.2020 21:00 - 22:00 | 300 | 0 | 0 | 0 |
| 27.01.2020 22:00 - 23:00 | 300 | 0 | 0 | 0 |
| 27.01.2020 23:00 - 24:00 | 300 | 0 | 0 | 0 |
| 28.01.2020 00:00 - 01:00 | 300 | 0 | 0 | 0 |
| 28.01.2020 01:00 - 02:00 | 300 | 0 | 0 | 0 |
| 28.01.2020 02:00 - 03:00 | 700 | 0 | 0 | 0 |
| 28.01.2020 03:00 - 04:00 | 700 | 0 | 0 | 0 |
| 28.01.2020 04:00 - 05:00 | 700 | 0 | 0 | 0 |
| 28.01.2020 05:00 - 06:00 | 700 | 0 | 0 | 0 |
| 28.01.2020 06:00 - 07:00 | 0 | 0 | 0 | 0 |
| 28.01.2020 07:00 - 08:00 | 0 | 0 | 0 | 0 |
| 28.01.2020 08:00 - 09:00 | 0 | 0 | 0 | 0 |
| 28.01.2020 09:00 - 10:00 | 0 | 0 | 0 | 0 |
| 28.01.2020 10:00 - 11:00 | 0 | 0 | 0 | 0 |
| 28.01.2020 11:00 - 12:00 | 0 | 0 | 0 | 0 |
| 28.01.2020 12:00 - 13:00 | 0 | 0 | 0 | 0 |
| 28.01.2020 13:00 - 14:00 | 0 | 0 | 0 | 0 |
| 28.01.2020 14:00 - 15:00 | 0 | 0 | 0 | 0 |
| 28.01.2020 15:00 - 16:00 | 0 | 0 | 0 | 0 |
| 28.01.2020 16:00 - 17:00 | 0 | 0 | 0 | 0 |
| 28.01.2020 17:00 - 18:00 | 0 | 0 | 0 | 0 |
| 28.01.2020 18:00 - 19:00 | 0 | 0 | 0 | 0 |
| 28.01.2020 19:00 - 20:00 | 0 | 0 | 0 | 0 |
| 28.01.2020 20:00 - 21:00 | 0 | 0 | 0 | 0 |
| 28.01.2020 21:00 - 22:00 | 0 | 0 | 0 | 0 |
| 28.01.2020 22:00 - 23:00 | 0 | 0 | 0 | 0 |
| 28.01.2020 23:00 - 24:00 | 0 | 0 | 0 | 0 |
| 29.01.2020 00:00 - 01:00 | 0 | 0 | 0 | 0 |
| 29.01.2020 01:00 - 02:00 | 0 | 0 | 0 | 0 |
| 29.01.2020 02:00 - 03:00 | 0 | 0 | 0 | 0 |
| 29.01.2020 03:00 - 04:00 | 700 | 0 | 0 | 0 |
| 29.01.2020 04:00 - 05:00 | 700 | 0 | 0 | 0 |
| 29.01.2020 05:00 - 06:00 | 700 | 0 | 0 | 0 |
| 29.01.2020 06:00 - 07:00 | 0 | 0 | 0 | 0 |
| 29.01.2020 07:00 - 08:00 | 0 | 0 | 0 | 0 |
| 29.01.2020 08:00 - 09:00 | 0 | 0 | 0 | 0 |
| 29.01.2020 09:00 - 10:00 | 0 | 0 | 0 | 0 |
| 29.01.2020 10:00 - 11:00 | 0 | 0 | 0 | 0 |
| 29.01.2020 11:00 - 12:00 | 0 | 0 | 0 | 0 |
| 29.01.2020 12:00 - 13:00 | 0 | 0 | 0 | 0 |
| 29.01.2020 13:00 - 14:00 | 0 | 0 | 0 | 0 |
| 29.01.2020 14:00 - 15:00 | 0 | 0 | 0 | 0 |
| 29.01.2020 15:00 - 16:00 | 0 | 0 | 0 | 0 |
| 29.01.2020 16:00 - 17:00 | 0 | 0 | 0 | 0 |
| 29.01.2020 17:00 - 18:00 | 0 | 0 | 0 | 0 |
| 29.01.2020 18:00 - 19:00 | 0 | 0 | 0 | 0 |
| 29.01.2020 19:00 - 20:00 | 0 | 0 | 0 | 0 |
| 29.01.2020 20:00 - 21:00 | 400 | 0 | 0 | 0 |
| 29.01.2020 21:00 - 22:00 | 400 | 0 | 0 | 0 |
| 29.01.2020 22:00 - 23:00 | 400 | 0 | 0 | 0 |
| 29.01.2020 23:00 - 24:00 | 400 | 0 | 0 | 0 |
| 30.01.2020 00:00 - 01:00 | 700 | 0 | 0 | 0 |
| 30.01.2020 01:00 - 02:00 | 700 | 0 | 0 | 0 |
| 30.01.2020 02:00 - 03:00 | 700 | 0 | 0 | 0 |
| 30.01.2020 03:00 - 04:00 | 700 | 0 | 0 | 0 |
| 30.01.2020 04:00 - 05:00 | 700 | 0 | 0 | 0 |
| 30.01.2020 05:00 - 06:00 | 700 | 0 | 0 | 0 |
| 30.01.2020 06:00 - 07:00 | 0 | 0 | 0 | 0 |
| 30.01.2020 07:00 - 08:00 | 0 | 0 | 0 | 0 |
| 30.01.2020 08:00 - 09:00 | 0 | 0 | 0 | 0 |
| 30.01.2020 09:00 - 10:00 | 0 | 0 | 0 | 0 |
| 30.01.2020 10:00 - 11:00 | 0 | 0 | 0 | 0 |
| 30.01.2020 11:00 - 12:00 | 0 | 0 | 0 | 0 |
| 30.01.2020 12:00 - 13:00 | 0 | 0 | 0 | 0 |
| 30.01.2020 13:00 - 14:00 | 0 | 0 | 0 | 0 |
| 30.01.2020 14:00 - 15:00 | 300 | 0 | 0 | 0 |
| 30.01.2020 15:00 - 16:00 | 300 | 0 | 0 | 0 |
| 30.01.2020 16:00 - 17:00 | 300 | 0 | 0 | 0 |
| 30.01.2020 17:00 - 18:00 | 300 | 0 | 0 | 0 |
| 30.01.2020 18:00 - 19:00 | 300 | 0 | 0 | 0 |
| 30.01.2020 19:00 - 20:00 | 300 | 0 | 0 | 0 |
| 30.01.2020 20:00 - 21:00 | 300 | 0 | 0 | 0 |
| 30.01.2020 21:00 - 22:00 | 300 | 0 | 0 | 0 |
| 30.01.2020 22:00 - 23:00 | 300 | 0 | 0 | 0 |
| 30.01.2020 23:00 - 24:00 | 300 | 0 | 0 | 0 |
| 31.01.2020 00:00 - 01:00 | 300 | 0 | 0 | 0 |
| 31.01.2020 01:00 - 02:00 | 300 | 0 | 0 | 0 |
| 31.01.2020 02:00 - 03:00 | 300 | 0 | 0 | 0 |
| 31.01.2020 03:00 - 04:00 | 300 | 0 | 0 | 0 |
| 31.01.2020 04:00 - 05:00 | 300 | 0 | 0 | 0 |
| 31.01.2020 05:00 - 06:00 | 300 | 0 | 0 | 0 |
| 31.01.2020 06:00 - 07:00 | 0 | 0 | 0 | 0 |
| 31.01.2020 07:00 - 08:00 | 0 | 0 | 0 | 0 |
| 31.01.2020 08:00 - 09:00 | 0 | 0 | 0 | 0 |
| 31.01.2020 09:00 - 10:00 | 0 | 0 | 0 | 0 |
| 31.01.2020 10:00 - 11:00 | 0 | 0 | 0 | 0 |
| 31.01.2020 11:00 - 12:00 | 0 | 0 | 0 | 0 |
| 31.01.2020 12:00 - 13:00 | 0 | 0 | 0 | 0 |
| 31.01.2020 13:00 - 14:00 | 0 | 0 | 0 | 0 |
| 31.01.2020 14:00 - 15:00 | 0 | 0 | 0 | 0 |
| 31.01.2020 15:00 - 16:00 | 0 | 0 | 0 | 0 |
| 31.01.2020 16:00 - 17:00 | 0 | 0 | 0 | 0 |
| 31.01.2020 17:00 - 18:00 | 0 | 0 | 0 | 0 |
| 31.01.2020 18:00 - 19:00 | 0 | 0 | 0 | 0 |
| 31.01.2020 19:00 - 20:00 | 0 | 0 | 0 | 0 |
| 31.01.2020 20:00 - 21:00 | 0 | 0 | 0 | 0 |
| 31.01.2020 21:00 - 22:00 | 0 | 0 | 0 | 0 |
| 31.01.2020 22:00 - 23:00 | 0 | 0 | 0 | 0 |
| 31.01.2020 23:00 - 24:00 | 0 | 0 | 0 | 0 |
| 01.02.2020 00:00 - 01:00 | 0 | 0 | 0 | 0 |
| 01.02.2020 01:00 - 02:00 | 0 | 0 | 0 | 0 |
| 01.02.2020 02:00 - 03:00 | 0 | 0 | 0 | 0 |
| 01.02.2020 03:00 - 04:00 | 0 | 0 | 0 | 0 |
| 01.02.2020 04:00 - 05:00 | 0 | 0 | 0 | 0 |
| 01.02.2020 05:00 - 06:00 | 0 | 0 | 0 | 0 |